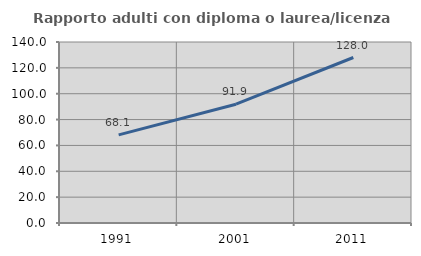
| Category | Rapporto adulti con diploma o laurea/licenza media  |
|---|---|
| 1991.0 | 68.135 |
| 2001.0 | 91.873 |
| 2011.0 | 128.009 |